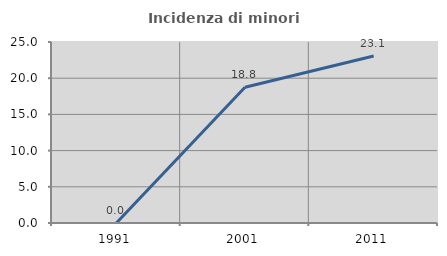
| Category | Incidenza di minori stranieri |
|---|---|
| 1991.0 | 0 |
| 2001.0 | 18.75 |
| 2011.0 | 23.077 |